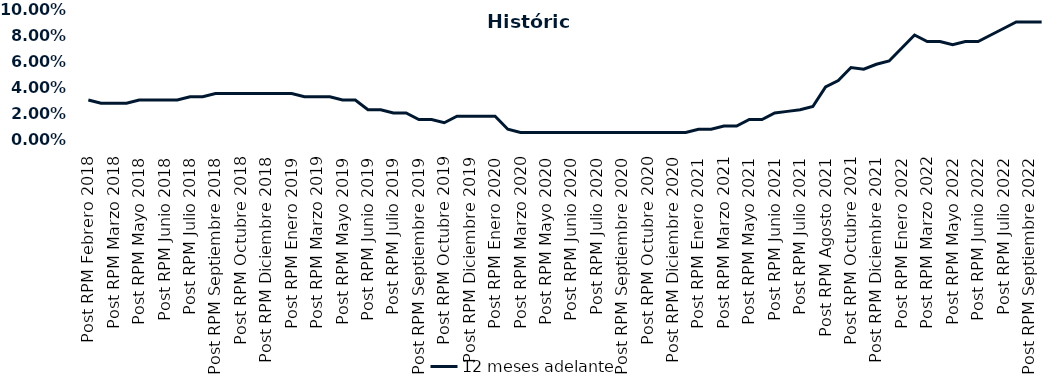
| Category | 12 meses adelante  |
|---|---|
| Post RPM Febrero 2018 | 0.03 |
| Pre RPM Marzo 2018 | 0.028 |
| Post RPM Marzo 2018 | 0.028 |
| Pre RPM Mayo 2018 | 0.028 |
| Post RPM Mayo 2018 | 0.03 |
| Pre RPM Junio 2018 | 0.03 |
| Post RPM Junio 2018 | 0.03 |
| Pre RPM Julio 2018 | 0.03 |
| Post RPM Julio 2018 | 0.032 |
| Pre RPM Septiembre 2018 | 0.032 |
| Post RPM Septiembre 2018 | 0.035 |
| Pre RPM Octubre 2018 | 0.035 |
| Post RPM Octubre 2018 | 0.035 |
| Pre RPM Diciembre 2018 | 0.035 |
| Post RPM Diciembre 2018 | 0.035 |
| Pre RPM Enero 2019 | 0.035 |
| Post RPM Enero 2019 | 0.035 |
| Pre RPM Marzo 2019 | 0.032 |
| Post RPM Marzo 2019 | 0.032 |
| Pre RPM Mayo 2019 | 0.032 |
| Post RPM Mayo 2019 | 0.03 |
| Pre RPM Junio 2019 | 0.03 |
| Post RPM Junio 2019 | 0.022 |
| Pre RPM Julio 2019 | 0.022 |
| Post RPM Julio 2019 | 0.02 |
| Pre RPM Septiembre 2019 | 0.02 |
| Post RPM Septiembre 2019 | 0.015 |
| Pre RPM Octubre 2019 | 0.015 |
| Post RPM Octubre 2019 | 0.012 |
| Pre RPM Diciembre 2019 | 0.018 |
| Post RPM Diciembre 2019 | 0.018 |
| Pre RPM Enero 2020 | 0.018 |
| Post RPM Enero 2020 | 0.018 |
| Pre RPM Marzo 2020 | 0.008 |
| Post RPM Marzo 2020 | 0.005 |
| Pre RPM Mayo 2020 | 0.005 |
| Post RPM Mayo 2020 | 0.005 |
| Pre RPM Junio 2020 | 0.005 |
| Post RPM Junio 2020 | 0.005 |
| Pre RPM Julio 2020 | 0.005 |
| Post RPM Julio 2020 | 0.005 |
| Pre RPM Septiembre 2020 | 0.005 |
| Post RPM Septiembre 2020 | 0.005 |
| Pre RPM Octubre 2020 | 0.005 |
| Post RPM Octubre 2020 | 0.005 |
| Pre RPM Diciembre 2020 | 0.005 |
| Post RPM Diciembre 2020 | 0.005 |
| Pre RPM Enero 2021 | 0.005 |
| Post RPM Enero 2021 | 0.008 |
| Pre RPM Marzo 2021 | 0.008 |
| Post RPM Marzo 2021 | 0.01 |
| Pre RPM Mayo 2021 | 0.01 |
| Post RPM Mayo 2021 | 0.015 |
| Pre RPM Junio 2021 | 0.015 |
| Post RPM Junio 2021 | 0.02 |
| Pre RPM Julio 2021 | 0.021 |
| Post RPM Julio 2021 | 0.022 |
| Pre RPM Agosto 2021 | 0.025 |
| Post RPM Agosto 2021 | 0.04 |
| Pre RPM Octubre 2021 | 0.045 |
| Post RPM Octubre 2021 | 0.055 |
| Pre RPM Diciembre 2021 | 0.054 |
| Post RPM Diciembre 2021 | 0.058 |
| Pre RPM Enero 2022 | 0.06 |
| Post RPM Enero 2022 | 0.07 |
| Pre RPM Marzo 2022 | 0.08 |
| Post RPM Marzo 2022 | 0.075 |
| Pre RPM Mayo 2022 | 0.075 |
| Post RPM Mayo 2022 | 0.072 |
| Pre RPM Junio 2022 | 0.075 |
| Post RPM Junio 2022 | 0.075 |
| Pre RPM Julio 2022 | 0.08 |
| Post RPM Julio 2022 | 0.085 |
| Pre RPM Septiembre 2022 | 0.09 |
| Post RPM Septiembre 2022 | 0.09 |
| Pre RPM Octubre 2022 | 0.09 |